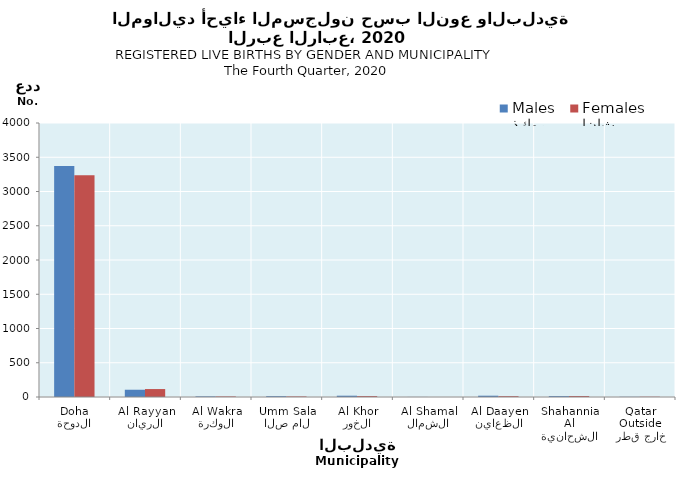
| Category | ذكور
Males | إناث
Females |
|---|---|---|
| الدوحة
Doha | 3372 | 3238 |
| الريان
Al Rayyan | 106 | 116 |
| الوكرة
Al Wakra | 9 | 8 |
| ام صلال
Umm Salal | 12 | 8 |
| الخور
Al Khor | 19 | 13 |
| الشمال
Al Shamal | 1 | 0 |
| الظعاين
Al Daayen | 19 | 12 |
| الشحانية
Al Shahannia | 13 | 14 |
| خارج قطر
Outside Qatar | 3 | 4 |